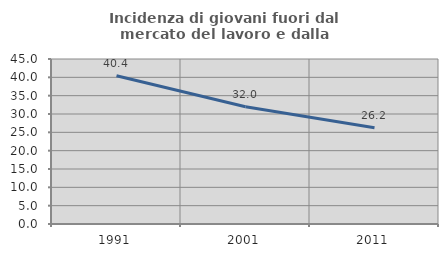
| Category | Incidenza di giovani fuori dal mercato del lavoro e dalla formazione  |
|---|---|
| 1991.0 | 40.432 |
| 2001.0 | 31.97 |
| 2011.0 | 26.235 |